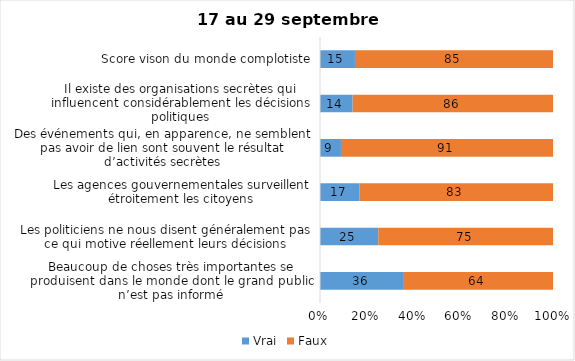
| Category | Vrai | Faux |
|---|---|---|
| Beaucoup de choses très importantes se produisent dans le monde dont le grand public n’est pas informé | 36 | 64 |
| Les politiciens ne nous disent généralement pas ce qui motive réellement leurs décisions | 25 | 75 |
| Les agences gouvernementales surveillent étroitement les citoyens | 17 | 83 |
| Des événements qui, en apparence, ne semblent pas avoir de lien sont souvent le résultat d’activités secrètes | 9 | 91 |
| Il existe des organisations secrètes qui influencent considérablement les décisions politiques | 14 | 86 |
| Score vison du monde complotiste | 15 | 85 |